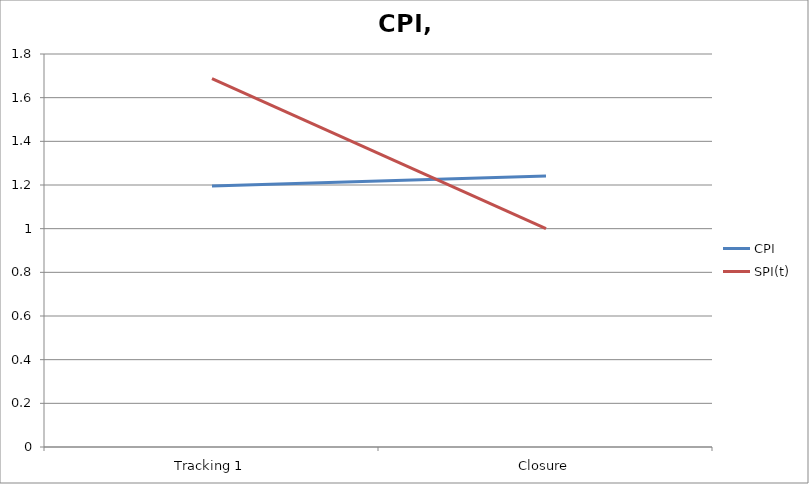
| Category | CPI | SPI(t) |
|---|---|---|
| Tracking 1 | 1.196 | 1.688 |
| Closure | 1.241 | 1 |